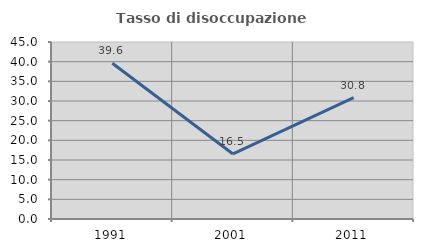
| Category | Tasso di disoccupazione giovanile  |
|---|---|
| 1991.0 | 39.599 |
| 2001.0 | 16.532 |
| 2011.0 | 30.833 |